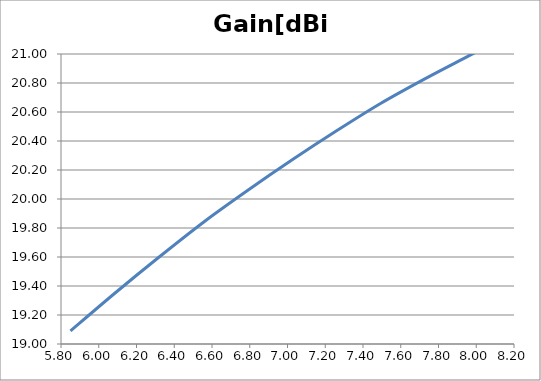
| Category | Gain[dBi] |
|---|---|
| 5.85 | 19.09 |
| 6.085 | 19.35 |
| 6.319999999999999 | 19.6 |
| 6.555 | 19.84 |
| 6.789999999999999 | 20.06 |
| 7.0249999999999995 | 20.27 |
| 7.26 | 20.47 |
| 7.494999999999999 | 20.66 |
| 7.7299999999999995 | 20.83 |
| 7.965 | 20.99 |
| 8.2 | 21.15 |